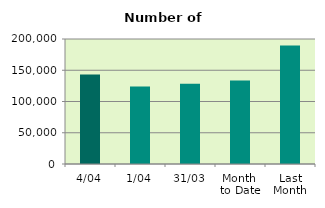
| Category | Series 0 |
|---|---|
| 4/04 | 143122 |
| 1/04 | 123862 |
| 31/03 | 128400 |
| Month 
to Date | 133492 |
| Last
Month | 189416.87 |